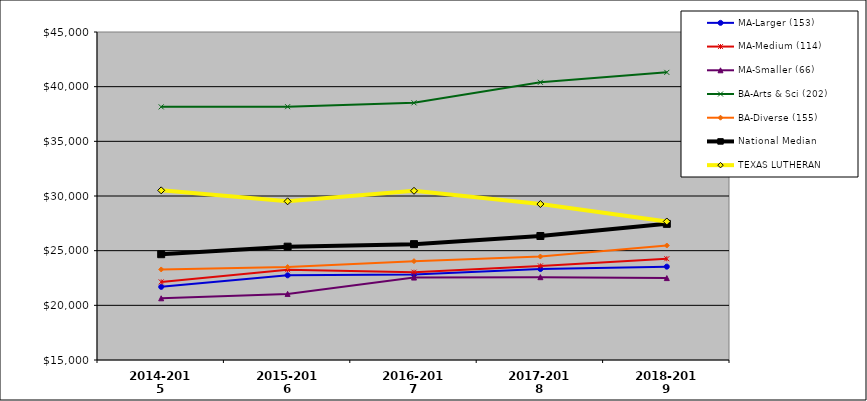
| Category | MA-Larger (153) | MA-Medium (114) | MA-Smaller (66) | BA-Arts & Sci (202) | BA-Diverse (155) | National Median | TEXAS LUTHERAN |
|---|---|---|---|---|---|---|---|
| 2014-2015 | 21688.939 | 22143.147 | 20643.973 | 38152.226 | 23281.936 | 24676.206 | 30515.957 |
| 2015-2016 | 22744.448 | 23259.405 | 21047.233 | 38168.998 | 23498.037 | 25364.205 | 29513.209 |
| 2016-2017 | 22810.337 | 23031.293 | 22541.254 | 38522.54 | 24041.377 | 25597.574 | 30475.146 |
| 2017-2018 | 23320.084 | 23606.109 | 22574.582 | 40399.903 | 24463.458 | 26342.841 | 29264.768 |
| 2018-2019 | 23538.19 | 24263.384 | 22490.741 | 41307.945 | 25470.054 | 27452.913 | 27668.054 |